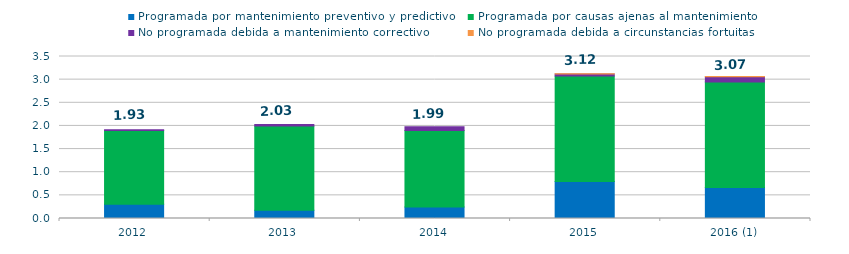
| Category | Programada por mantenimiento preventivo y predictivo | Programada por causas ajenas al mantenimiento  | No programada debida a mantenimiento correctivo  | No programada debida a circunstancias fortuitas  |
|---|---|---|---|---|
| 2012 | 0.31 | 1.59 | 0.02 | 0 |
| 2013 | 0.18 | 1.82 | 0.03 | 0 |
| 2014 | 0.25 | 1.65 | 0.08 | 0 |
| 2015 | 0.8 | 2.28 | 0.04 | 0.01 |
| 2016 (1) | 0.67 | 2.28 | 0.11 | 0.01 |